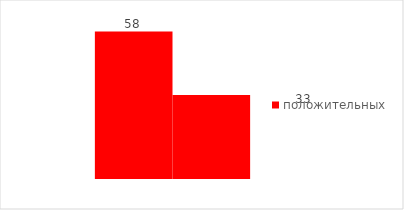
| Category | положительных |
|---|---|
| 0 | 33 |